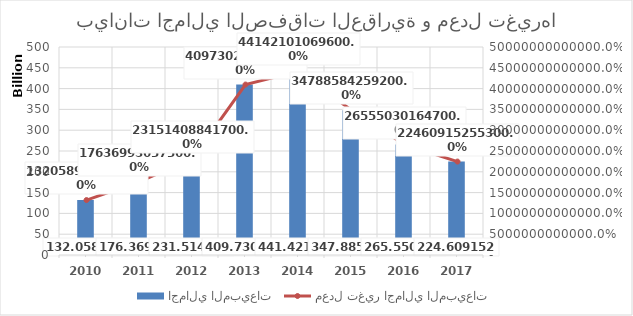
| Category | اجمالي المبيعات |
|---|---|
| 2010 | 94740319943 |
| 2011 | 106675530921 |
| 2012 | 101850082682 |
| 2013 | 135934973143 |
| 2014 | 145770931097 |
| 2015 | 118616536082 |
| 2016 | 99884848447 |
| 2017 | 87144302204 |